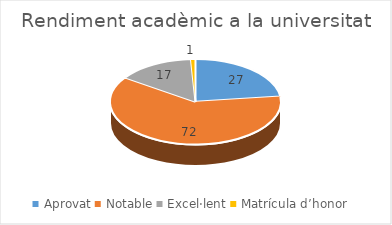
| Category | Series 0 |
|---|---|
| Aprovat | 27 |
| Notable | 72 |
| Excel·lent | 17 |
| Matrícula d’honor | 1 |